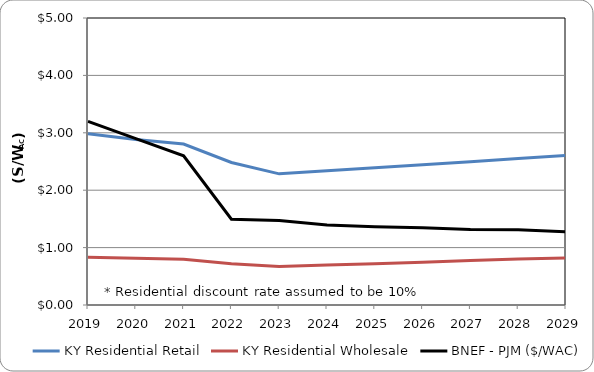
| Category | KY Residential Retail | KY Residential Wholesale | BNEF - PJM ($/WAC) |
|---|---|---|---|
| 2019.0 | 2.983 | 0.832 | 3.2 |
| 2020.0 | 2.885 | 0.813 | 2.9 |
| 2021.0 | 2.803 | 0.799 | 2.601 |
| 2022.0 | 2.483 | 0.718 | 1.495 |
| 2023.0 | 2.285 | 0.671 | 1.471 |
| 2024.0 | 2.337 | 0.695 | 1.392 |
| 2025.0 | 2.39 | 0.72 | 1.363 |
| 2026.0 | 2.443 | 0.746 | 1.347 |
| 2027.0 | 2.496 | 0.773 | 1.316 |
| 2028.0 | 2.551 | 0.801 | 1.312 |
| 2029.0 | 2.606 | 0.817 | 1.277 |